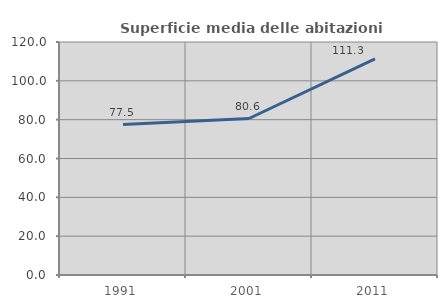
| Category | Superficie media delle abitazioni occupate |
|---|---|
| 1991.0 | 77.5 |
| 2001.0 | 80.6 |
| 2011.0 | 111.3 |